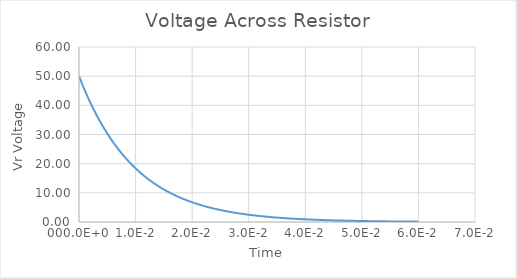
| Category | Series 0 |
|---|---|
| 0.0 | 50 |
| 0.0005 | 47.561 |
| 0.001 | 45.242 |
| 0.0015 | 43.035 |
| 0.002 | 40.937 |
| 0.0025 | 38.94 |
| 0.003 | 37.041 |
| 0.0035 | 35.234 |
| 0.004 | 33.516 |
| 0.0045 | 31.881 |
| 0.005 | 30.327 |
| 0.0055 | 28.847 |
| 0.006 | 27.441 |
| 0.0065 | 26.102 |
| 0.007 | 24.829 |
| 0.0075 | 23.618 |
| 0.008 | 22.466 |
| 0.0085 | 21.371 |
| 0.009 | 20.328 |
| 0.0095 | 19.337 |
| 0.01 | 18.394 |
| 0.0105 | 17.497 |
| 0.011 | 16.644 |
| 0.0115 | 15.832 |
| 0.012 | 15.06 |
| 0.0125 | 14.325 |
| 0.013 | 13.627 |
| 0.0135 | 12.962 |
| 0.014 | 12.33 |
| 0.0145 | 11.729 |
| 0.015 | 11.157 |
| 0.0155 | 10.612 |
| 0.016 | 10.095 |
| 0.0165 | 9.602 |
| 0.017 | 9.134 |
| 0.0175 | 8.689 |
| 0.018 | 8.265 |
| 0.0185 | 7.862 |
| 0.019 | 7.478 |
| 0.0195 | 7.114 |
| 0.02 | 6.767 |
| 0.0205 | 6.437 |
| 0.021 | 6.123 |
| 0.0215 | 5.824 |
| 0.022 | 5.54 |
| 0.0225 | 5.27 |
| 0.023 | 5.013 |
| 0.0235 | 4.768 |
| 0.024 | 4.536 |
| 0.0245 | 4.315 |
| 0.025 | 4.104 |
| 0.0255 | 3.904 |
| 0.026 | 3.714 |
| 0.0265 | 3.533 |
| 0.027 | 3.36 |
| 0.0275 | 3.196 |
| 0.028 | 3.041 |
| 0.0285 | 2.892 |
| 0.029 | 2.751 |
| 0.0295 | 2.617 |
| 0.03 | 2.489 |
| 0.0305 | 2.368 |
| 0.031 | 2.252 |
| 0.0315 | 2.143 |
| 0.032 | 2.038 |
| 0.0325 | 1.939 |
| 0.033 | 1.844 |
| 0.0335 | 1.754 |
| 0.034 | 1.669 |
| 0.0345 | 1.587 |
| 0.035 | 1.51 |
| 0.0355 | 1.436 |
| 0.036 | 1.366 |
| 0.0364999999999999 | 1.3 |
| 0.0369999999999999 | 1.236 |
| 0.0375 | 1.176 |
| 0.038 | 1.119 |
| 0.0384999999999999 | 1.064 |
| 0.0389999999999999 | 1.012 |
| 0.0394999999999999 | 0.963 |
| 0.0399999999999999 | 0.916 |
| 0.0404999999999999 | 0.871 |
| 0.0409999999999999 | 0.829 |
| 0.0414999999999999 | 0.788 |
| 0.0419999999999999 | 0.75 |
| 0.0424999999999999 | 0.713 |
| 0.0429999999999999 | 0.678 |
| 0.0434999999999999 | 0.645 |
| 0.0439999999999999 | 0.614 |
| 0.0444999999999999 | 0.584 |
| 0.0449999999999999 | 0.555 |
| 0.0454999999999999 | 0.528 |
| 0.0459999999999999 | 0.503 |
| 0.0464999999999999 | 0.478 |
| 0.0469999999999999 | 0.455 |
| 0.0474999999999999 | 0.433 |
| 0.0479999999999999 | 0.411 |
| 0.0484999999999999 | 0.391 |
| 0.0489999999999999 | 0.372 |
| 0.0494999999999999 | 0.354 |
| 0.0499999999999999 | 0.337 |
| 0.0504999999999999 | 0.32 |
| 0.0509999999999999 | 0.305 |
| 0.0514999999999999 | 0.29 |
| 0.0519999999999999 | 0.276 |
| 0.0524999999999999 | 0.262 |
| 0.0529999999999999 | 0.25 |
| 0.0534999999999999 | 0.237 |
| 0.0539999999999998 | 0.226 |
| 0.0544999999999998 | 0.215 |
| 0.0549999999999998 | 0.204 |
| 0.0554999999999998 | 0.194 |
| 0.0559999999999998 | 0.185 |
| 0.0564999999999998 | 0.176 |
| 0.0569999999999998 | 0.167 |
| 0.0574999999999998 | 0.159 |
| 0.0579999999999998 | 0.151 |
| 0.0584999999999998 | 0.144 |
| 0.0589999999999998 | 0.137 |
| 0.0594999999999998 | 0.13 |
| 0.0599999999999998 | 0.124 |